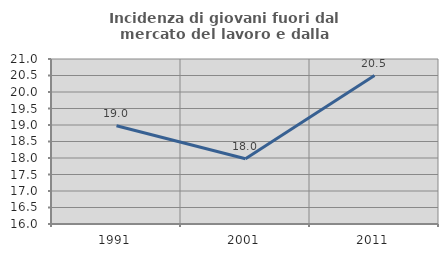
| Category | Incidenza di giovani fuori dal mercato del lavoro e dalla formazione  |
|---|---|
| 1991.0 | 18.978 |
| 2001.0 | 17.978 |
| 2011.0 | 20.497 |